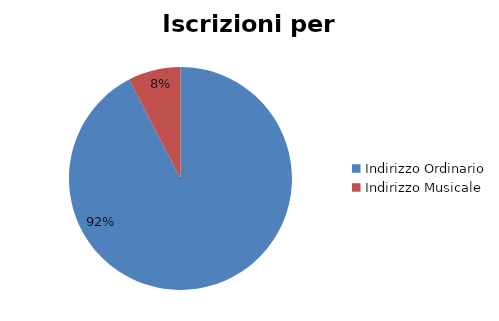
| Category | #REF! |
|---|---|
| Indirizzo Ordinario | 34993 |
| Indirizzo Musicale | 2885 |